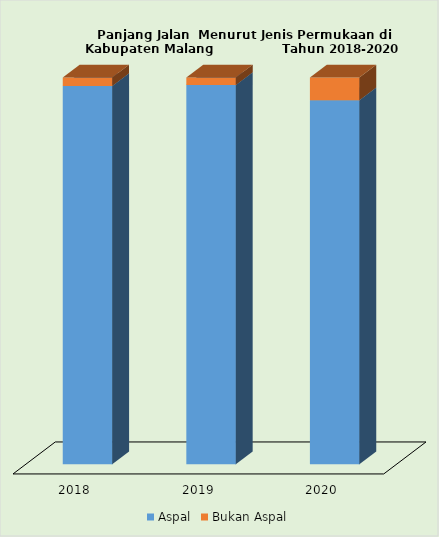
| Category | Aspal | Bukan Aspal |
|---|---|---|
| 2018.0 | 1631.697 | 37.065 |
| 2019.0 | 1635.697 | 33.065 |
| 2020.0 | 1570.71 | 98.05 |